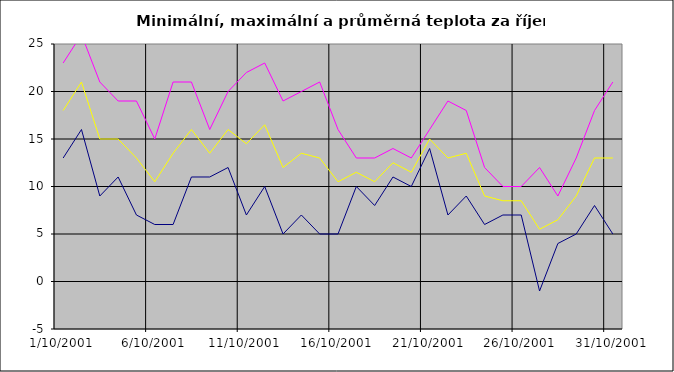
| Category | Series 0 | Series 1 | Series 2 |
|---|---|---|---|
| 2001-10-01 | 13 | 23 | 18 |
| 2001-10-02 | 16 | 26 | 21 |
| 2001-10-03 | 9 | 21 | 15 |
| 2001-10-04 | 11 | 19 | 15 |
| 2001-10-05 | 7 | 19 | 13 |
| 2001-10-06 | 6 | 15 | 10.5 |
| 2001-10-07 | 6 | 21 | 13.5 |
| 2001-10-08 | 11 | 21 | 16 |
| 2001-10-09 | 11 | 16 | 13.5 |
| 2001-10-10 | 12 | 20 | 16 |
| 2001-10-11 | 7 | 22 | 14.5 |
| 2001-10-12 | 10 | 23 | 16.5 |
| 2001-10-13 | 5 | 19 | 12 |
| 2001-10-14 | 7 | 20 | 13.5 |
| 2001-10-15 | 5 | 21 | 13 |
| 2001-10-16 | 5 | 16 | 10.5 |
| 2001-10-17 | 10 | 13 | 11.5 |
| 2001-10-18 | 8 | 13 | 10.5 |
| 2001-10-19 | 11 | 14 | 12.5 |
| 2001-10-20 | 10 | 13 | 11.5 |
| 2001-10-21 | 14 | 16 | 15 |
| 2001-10-22 | 7 | 19 | 13 |
| 2001-10-23 | 9 | 18 | 13.5 |
| 2001-10-24 | 6 | 12 | 9 |
| 2001-10-25 | 7 | 10 | 8.5 |
| 2001-10-26 | 7 | 10 | 8.5 |
| 2001-10-27 | -1 | 12 | 5.5 |
| 2001-10-28 | 4 | 9 | 6.5 |
| 2001-10-29 | 5 | 13 | 9 |
| 2001-10-30 | 8 | 18 | 13 |
| 2001-10-31 | 5 | 21 | 13 |